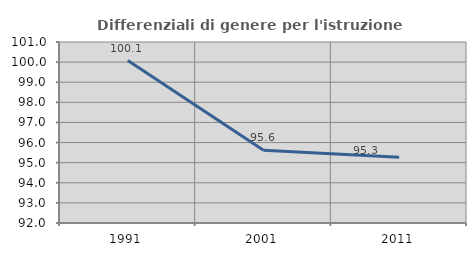
| Category | Differenziali di genere per l'istruzione superiore |
|---|---|
| 1991.0 | 100.08 |
| 2001.0 | 95.622 |
| 2011.0 | 95.273 |